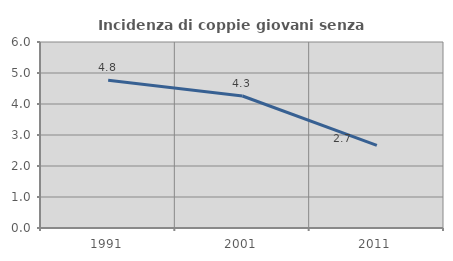
| Category | Incidenza di coppie giovani senza figli |
|---|---|
| 1991.0 | 4.769 |
| 2001.0 | 4.258 |
| 2011.0 | 2.663 |